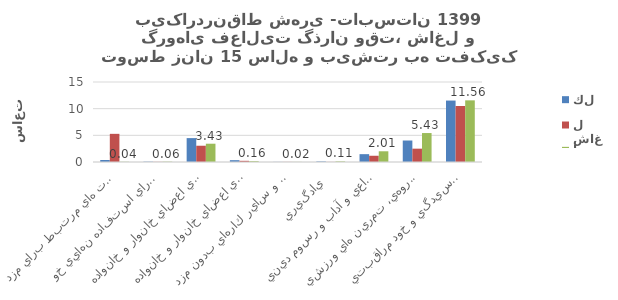
| Category | كل | شاغل | بيكار |
|---|---|---|---|
| اشتغال و فعاليت هاي مرتبط براي مزد  | 0.37 | 5.28 | 0.04 |
| توليد كالا براي استفاده نهايي خود   | 0.06 | 0.03 | 0.06 |
| خدمات خانگي بدون مزد براي اعضاي خانوار و خانواده   | 4.48 | 3.05 | 3.43 |
| خدمات مراقبتي بدون مزد براي اعضاي خانوار و خانواده   | 0.34 | 0.22 | 0.16 |
| كارداوطلبانه بدون مزد، كار آموزي و ساير كارهاي بدون مزد  | 0.02 | 0.02 | 0.02 |
| يادگيري  | 0.1 | 0.02 | 0.11 |
| معاشرت، ارتباط، مشاركت اجتماعي و آداب و رسوم ديني  | 1.47 | 1.17 | 2.01 |
| فرهنگ، فراغت، رسانه هاي گروهي، تمرين هاي ورزشي  | 4.03 | 2.5 | 5.43 |
| رسيدگي و خود مراقبتي   | 11.52 | 10.5 | 11.56 |